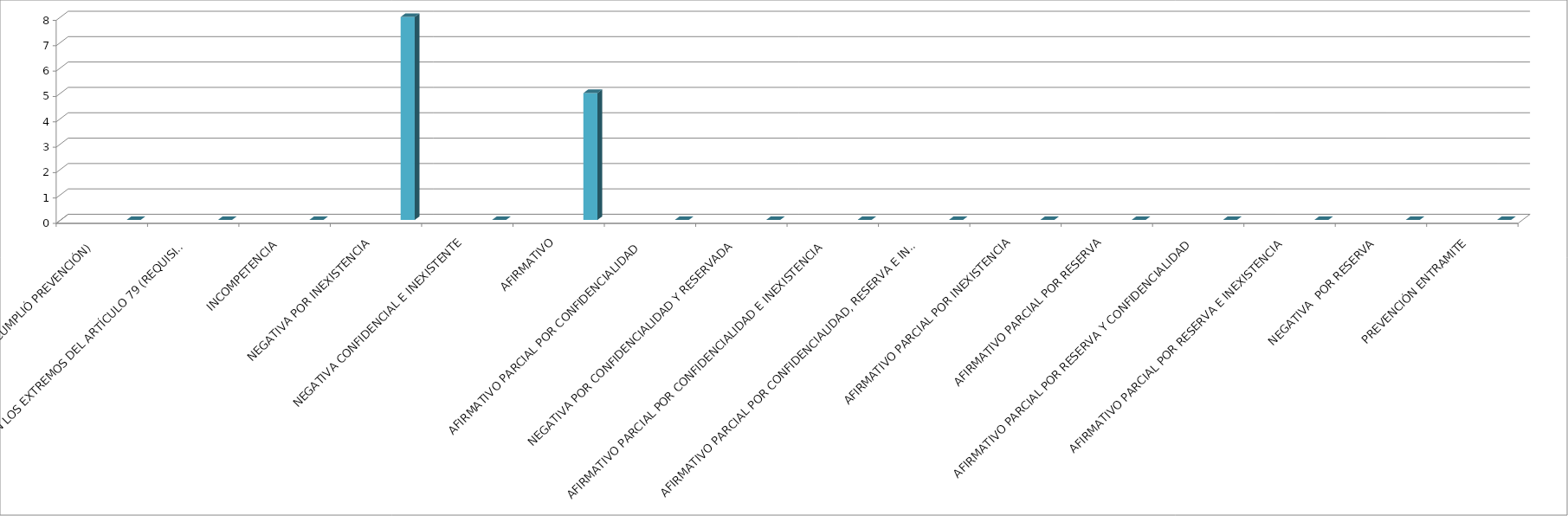
| Category | Series 0 | Series 1 | Series 2 | Series 3 | Series 4 |
|---|---|---|---|---|---|
| SE TIENE POR NO PRESENTADA ( NO CUMPLIÓ PREVENCIÓN) |  |  |  |  | 0 |
| NO CUMPLIO CON LOS EXTREMOS DEL ARTÍCULO 79 (REQUISITOS) |  |  |  |  | 0 |
| INCOMPETENCIA  |  |  |  |  | 0 |
| NEGATIVA POR INEXISTENCIA |  |  |  |  | 8 |
| NEGATIVA CONFIDENCIAL E INEXISTENTE |  |  |  |  | 0 |
| AFIRMATIVO |  |  |  |  | 5 |
| AFIRMATIVO PARCIAL POR CONFIDENCIALIDAD  |  |  |  |  | 0 |
| NEGATIVA POR CONFIDENCIALIDAD Y RESERVADA |  |  |  |  | 0 |
| AFIRMATIVO PARCIAL POR CONFIDENCIALIDAD E INEXISTENCIA |  |  |  |  | 0 |
| AFIRMATIVO PARCIAL POR CONFIDENCIALIDAD, RESERVA E INEXISTENCIA |  |  |  |  | 0 |
| AFIRMATIVO PARCIAL POR INEXISTENCIA |  |  |  |  | 0 |
| AFIRMATIVO PARCIAL POR RESERVA |  |  |  |  | 0 |
| AFIRMATIVO PARCIAL POR RESERVA Y CONFIDENCIALIDAD |  |  |  |  | 0 |
| AFIRMATIVO PARCIAL POR RESERVA E INEXISTENCIA |  |  |  |  | 0 |
| NEGATIVA  POR RESERVA |  |  |  |  | 0 |
| PREVENCIÓN ENTRAMITE |  |  |  |  | 0 |